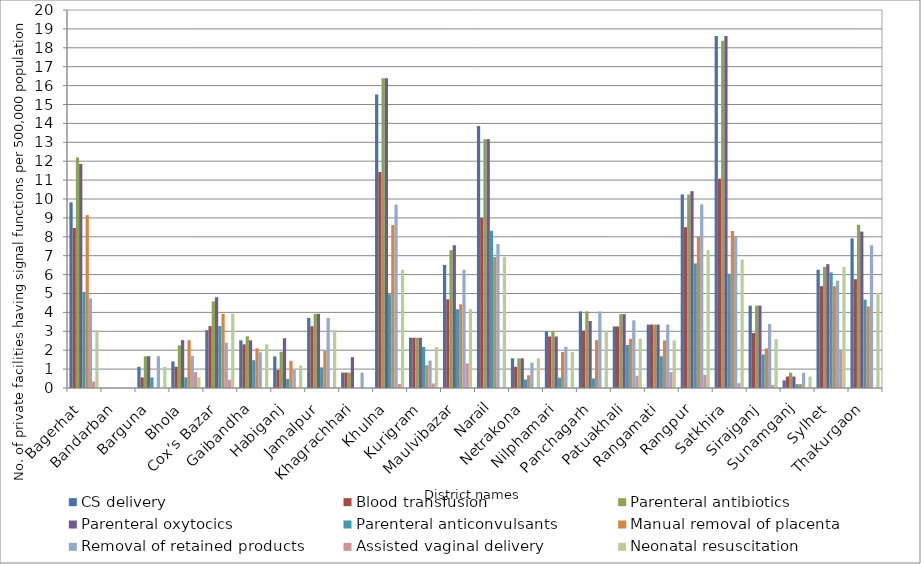
| Category | CS delivery | Blood transfusion | Parenteral antibiotics | Parenteral oxytocics | Parenteral anticonvulsants | Manual removal of placenta | Removal of retained products | Assisted vaginal delivery | Neonatal resuscitation |
|---|---|---|---|---|---|---|---|---|---|
| Bagerhat | 9.823 | 8.468 | 12.194 | 11.856 | 5.081 | 9.146 | 4.742 | 0.339 | 3.049 |
| Bandarban | 0 | 0 | 0 | 0 | 0 | 0 | 0 | 0 | 0 |
| Barguna | 1.12 | 0.56 | 1.68 | 1.68 | 0.56 | 0 | 1.68 | 0 | 1.12 |
| Bhola | 1.407 | 1.126 | 2.251 | 2.533 | 0.563 | 2.533 | 1.688 | 0.844 | 0.563 |
| Cox’s Bazar | 3.057 | 3.275 | 4.585 | 4.804 | 3.275 | 3.93 | 2.402 | 0.437 | 3.93 |
| Gaibandha | 2.522 | 2.312 | 2.732 | 2.522 | 1.471 | 2.101 | 1.891 | 0 | 2.312 |
| Habiganj | 1.675 | 0.957 | 1.915 | 2.633 | 0.479 | 1.436 | 0.957 | 0 | 1.197 |
| Jamalpur | 3.707 | 3.271 | 3.926 | 3.926 | 1.09 | 1.963 | 3.707 | 0 | 3.053 |
| Khagrachhari | 0.814 | 0.814 | 0.814 | 1.629 | 0 | 0 | 0.814 | 0 | 0 |
| Khulna | 15.527 | 11.43 | 16.39 | 16.39 | 4.96 | 8.626 | 9.704 | 0.216 | 6.254 |
| Kurigram | 2.658 | 2.658 | 2.658 | 2.658 | 2.175 | 1.208 | 1.45 | 0.242 | 2.175 |
| Maulvibazar | 6.514 | 4.69 | 7.295 | 7.556 | 4.169 | 4.429 | 6.253 | 1.303 | 4.169 |
| Narail | 13.857 | 9.007 | 13.164 | 13.164 | 8.314 | 6.928 | 7.621 | 0 | 6.928 |
| Netrakona | 1.57 | 1.121 | 1.57 | 1.57 | 0.449 | 0.673 | 1.346 | 0 | 1.57 |
| Nilphamari | 2.999 | 2.726 | 2.999 | 2.726 | 0.545 | 1.908 | 2.181 | 0 | 1.908 |
| Panchagarh | 4.05 | 3.038 | 4.05 | 3.544 | 0.506 | 2.531 | 4.05 | 0 | 3.038 |
| Patuakhali | 3.256 | 3.256 | 3.907 | 3.907 | 2.279 | 2.604 | 3.581 | 0.651 | 2.604 |
| Rangamati | 3.356 | 3.356 | 3.356 | 3.356 | 1.678 | 2.517 | 3.356 | 0.839 | 2.517 |
| Rangpur | 10.239 | 8.504 | 10.239 | 10.413 | 6.595 | 7.983 | 9.719 | 0.694 | 7.289 |
| Satkhira | 18.631 | 11.078 | 18.379 | 18.631 | 6.042 | 8.308 | 8.057 | 0.252 | 6.798 |
| Sirajganj | 4.358 | 2.906 | 4.358 | 4.358 | 1.776 | 2.098 | 3.39 | 0.161 | 2.583 |
| Sunamganj | 0.405 | 0.608 | 0.81 | 0.608 | 0.203 | 0.203 | 0.81 | 0 | 0.608 |
| Sylhet | 6.261 | 5.387 | 6.406 | 6.552 | 6.115 | 5.387 | 5.678 | 2.038 | 6.406 |
| Thakurgaon | 7.913 | 5.755 | 8.633 | 8.273 | 4.676 | 4.316 | 7.554 | 0 | 5.036 |